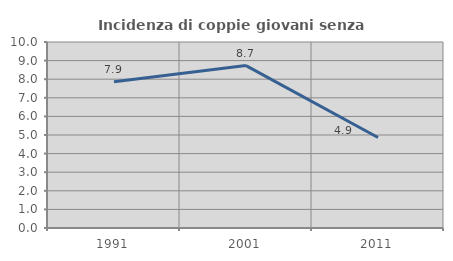
| Category | Incidenza di coppie giovani senza figli |
|---|---|
| 1991.0 | 7.862 |
| 2001.0 | 8.732 |
| 2011.0 | 4.867 |